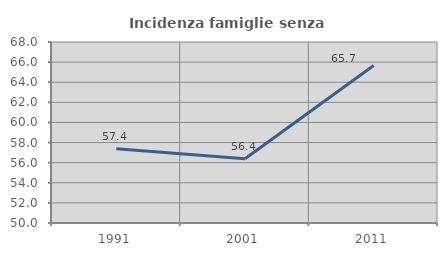
| Category | Incidenza famiglie senza nuclei |
|---|---|
| 1991.0 | 57.377 |
| 2001.0 | 56.395 |
| 2011.0 | 65.663 |